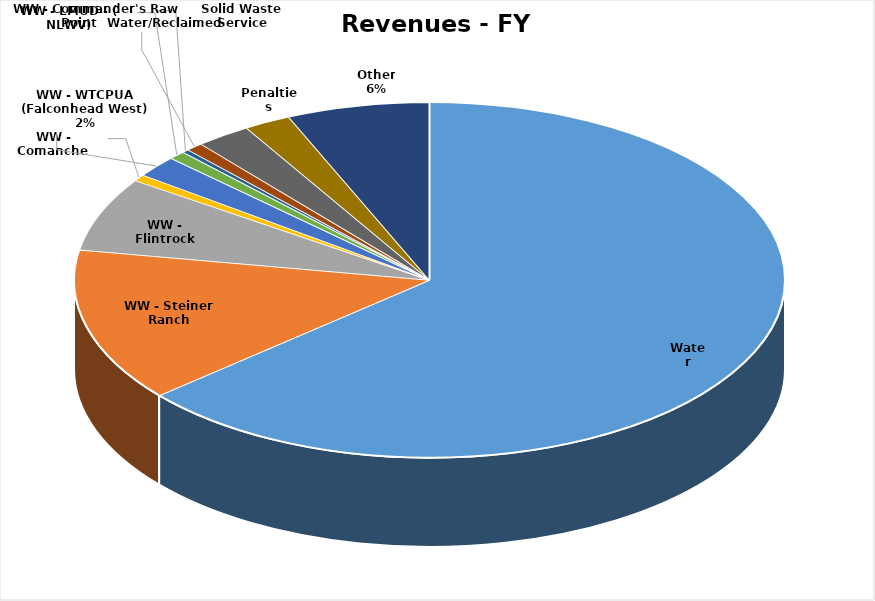
| Category | Series 0 | Series 1 |
|---|---|---|
| Water | 13230500 | 0.637 |
| WW - Steiner Ranch | 2900600 | 0.14 |
| WW - Flintrock | 1400000 | 0.067 |
| WW - Comanche  | 125000 | 0.006 |
| WW - WTCPUA (Falconhead West) | 406000 | 0.02 |
| WW - LMUD - ( NLWV) | 160000 | 0.008 |
| WW - Commander's Point | 64000 | 0.003 |
| Raw Water/Reclaimed | 161000 | 0.008 |
| Solid Waste Service | 519000 | 0.025 |
| Penalties | 442600 | 0.021 |
| Other | 1345681 | 0.065 |